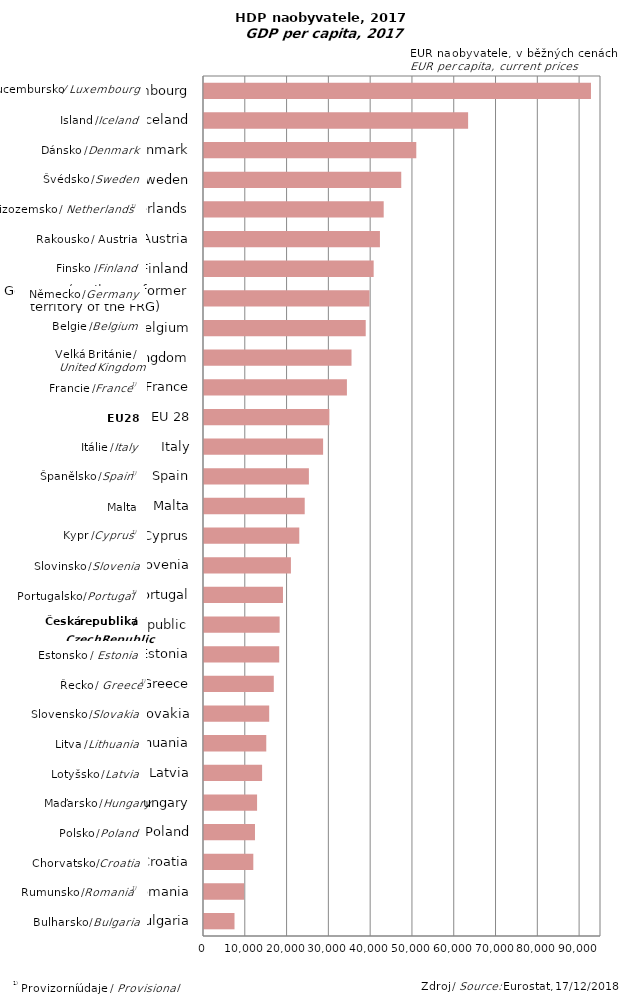
| Category | Series 0 |
|---|---|
| Bulgaria | 7300 |
| Romania | 9600 |
| Croatia | 11800 |
| Poland | 12200 |
| Hungary | 12700 |
| Latvia | 13900 |
| Lithuania | 14900 |
| Slovakia | 15600 |
| Greece | 16700 |
| Estonia | 18000 |
| Czech Republic | 18100 |
| Portugal | 18900 |
| Slovenia | 20800 |
| Cyprus | 22800 |
| Malta | 24100 |
| Spain | 25100 |
| Italy | 28500 |
| EU 28 | 30000 |
| France | 34200 |
| United Kingdom | 35300 |
| Belgium | 38700 |
| Germany (until 1990 former territory of the FRG) | 39600 |
| Finland | 40600 |
| Austria | 42100 |
| Netherlands | 43000 |
| Sweden | 47200 |
| Denmark | 50800 |
| Iceland | 63200 |
| Luxembourg | 92600 |